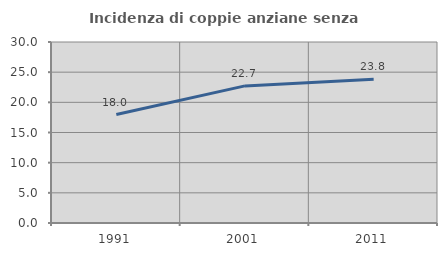
| Category | Incidenza di coppie anziane senza figli  |
|---|---|
| 1991.0 | 17.982 |
| 2001.0 | 22.727 |
| 2011.0 | 23.841 |